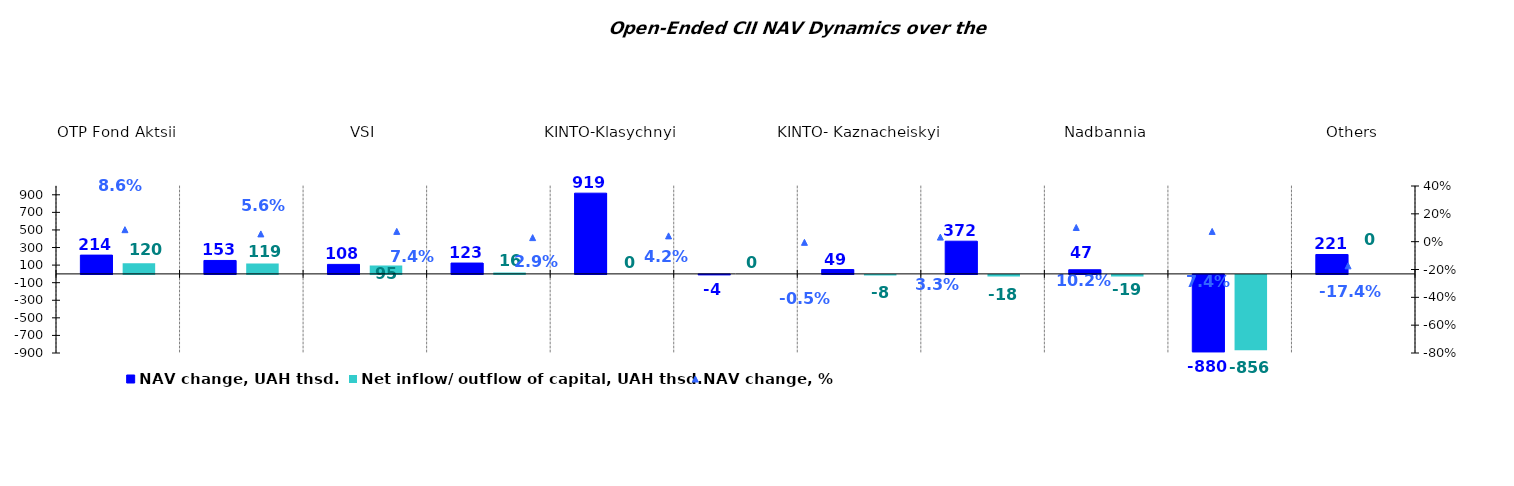
| Category | NAV change, UAH thsd. | Net inflow/ outflow of capital, UAH thsd. |
|---|---|---|
| ОТP Fond Aktsii | 213.632 | 120.204 |
| ОТP Klasychnyi | 152.901 | 118.539 |
| VSI | 107.983 | 94.683 |
| Sofiivskyi | 123.289 | 16.427 |
| KINTO-Klasychnyi | 918.516 | 0 |
| Bonum Optimum | -3.563 | 0 |
| KINTO- Kaznacheiskyi | 49.263 | -7.85 |
| KINTO-Ekviti | 371.947 | -18.441 |
| Nadbannia | 47.037 | -18.844 |
| UNIVER.UA/Myhailo Hrushevskyi: Fond Derzhavnykh Paperiv    | -880.417 | -855.921 |
| Others | 220.739 | 0 |